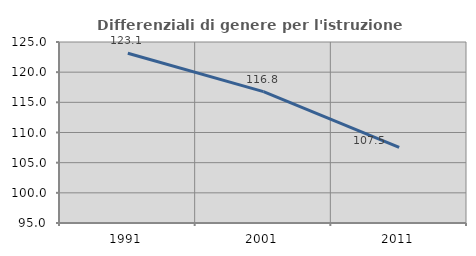
| Category | Differenziali di genere per l'istruzione superiore |
|---|---|
| 1991.0 | 123.145 |
| 2001.0 | 116.784 |
| 2011.0 | 107.537 |